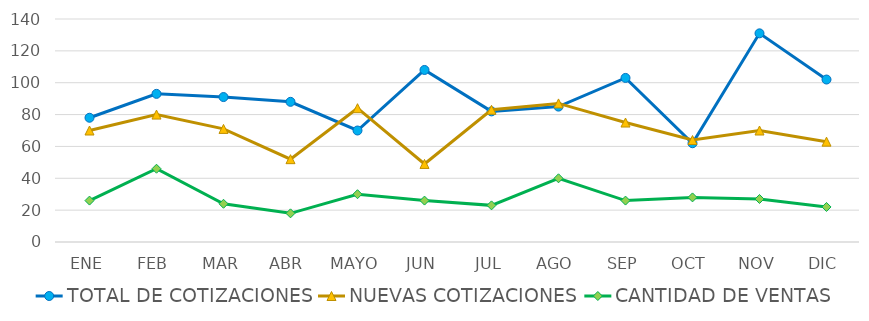
| Category | TOTAL DE COTIZACIONES | NUEVAS COTIZACIONES | CANTIDAD DE VENTAS |
|---|---|---|---|
| ENE | 78 | 70 | 26 |
| FEB | 93 | 80 | 46 |
| MAR | 91 | 71 | 24 |
| ABR | 88 | 52 | 18 |
| MAYO | 70 | 84 | 30 |
| JUN | 108 | 49 | 26 |
| JUL | 82 | 83 | 23 |
| AGO | 85 | 87 | 40 |
| SEP | 103 | 75 | 26 |
| OCT | 62 | 64 | 28 |
| NOV | 131 | 70 | 27 |
| DIC | 102 | 63 | 22 |